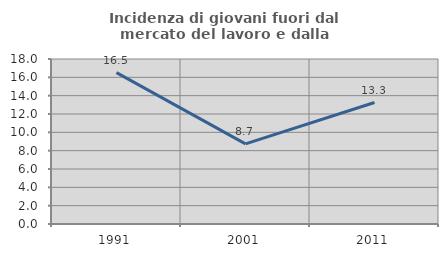
| Category | Incidenza di giovani fuori dal mercato del lavoro e dalla formazione  |
|---|---|
| 1991.0 | 16.514 |
| 2001.0 | 8.738 |
| 2011.0 | 13.253 |